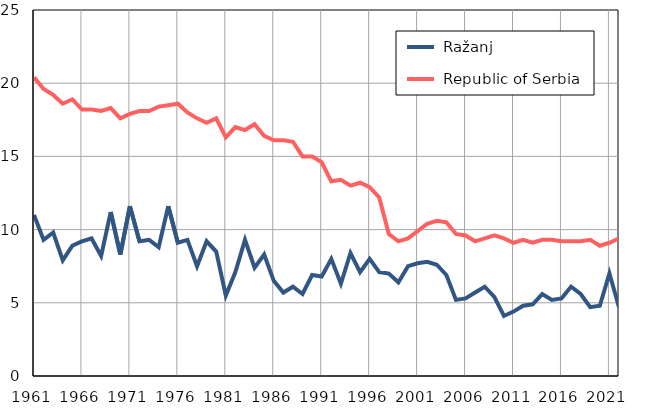
| Category |  Ražanj |  Republic of Serbia |
|---|---|---|
| 1961.0 | 11 | 20.4 |
| 1962.0 | 9.3 | 19.6 |
| 1963.0 | 9.8 | 19.2 |
| 1964.0 | 7.9 | 18.6 |
| 1965.0 | 8.9 | 18.9 |
| 1966.0 | 9.2 | 18.2 |
| 1967.0 | 9.4 | 18.2 |
| 1968.0 | 8.2 | 18.1 |
| 1969.0 | 11.2 | 18.3 |
| 1970.0 | 8.3 | 17.6 |
| 1971.0 | 11.6 | 17.9 |
| 1972.0 | 9.2 | 18.1 |
| 1973.0 | 9.3 | 18.1 |
| 1974.0 | 8.8 | 18.4 |
| 1975.0 | 11.6 | 18.5 |
| 1976.0 | 9.1 | 18.6 |
| 1977.0 | 9.3 | 18 |
| 1978.0 | 7.5 | 17.6 |
| 1979.0 | 9.2 | 17.3 |
| 1980.0 | 8.5 | 17.6 |
| 1981.0 | 5.5 | 16.3 |
| 1982.0 | 7.1 | 17 |
| 1983.0 | 9.3 | 16.8 |
| 1984.0 | 7.4 | 17.2 |
| 1985.0 | 8.3 | 16.4 |
| 1986.0 | 6.5 | 16.1 |
| 1987.0 | 5.7 | 16.1 |
| 1988.0 | 6.1 | 16 |
| 1989.0 | 5.6 | 15 |
| 1990.0 | 6.9 | 15 |
| 1991.0 | 6.8 | 14.6 |
| 1992.0 | 8 | 13.3 |
| 1993.0 | 6.3 | 13.4 |
| 1994.0 | 8.4 | 13 |
| 1995.0 | 7.1 | 13.2 |
| 1996.0 | 8 | 12.9 |
| 1997.0 | 7.1 | 12.2 |
| 1998.0 | 7 | 9.7 |
| 1999.0 | 6.4 | 9.2 |
| 2000.0 | 7.5 | 9.4 |
| 2001.0 | 7.7 | 9.9 |
| 2002.0 | 7.8 | 10.4 |
| 2003.0 | 7.6 | 10.6 |
| 2004.0 | 6.9 | 10.5 |
| 2005.0 | 5.2 | 9.7 |
| 2006.0 | 5.3 | 9.6 |
| 2007.0 | 5.7 | 9.2 |
| 2008.0 | 6.1 | 9.4 |
| 2009.0 | 5.4 | 9.6 |
| 2010.0 | 4.1 | 9.4 |
| 2011.0 | 4.4 | 9.1 |
| 2012.0 | 4.8 | 9.3 |
| 2013.0 | 4.9 | 9.1 |
| 2014.0 | 5.6 | 9.3 |
| 2015.0 | 5.2 | 9.3 |
| 2016.0 | 5.3 | 9.2 |
| 2017.0 | 6.1 | 9.2 |
| 2018.0 | 5.6 | 9.2 |
| 2019.0 | 4.7 | 9.3 |
| 2020.0 | 4.8 | 8.9 |
| 2021.0 | 7 | 9.1 |
| 2022.0 | 4.7 | 9.4 |